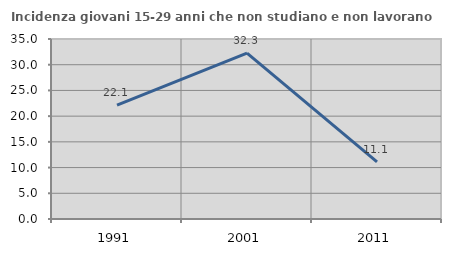
| Category | Incidenza giovani 15-29 anni che non studiano e non lavorano  |
|---|---|
| 1991.0 | 22.128 |
| 2001.0 | 32.258 |
| 2011.0 | 11.111 |